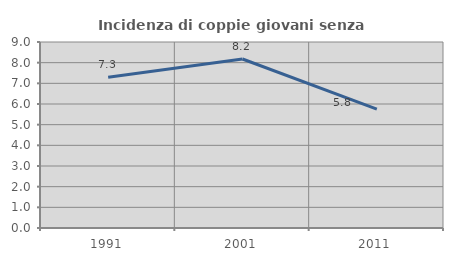
| Category | Incidenza di coppie giovani senza figli |
|---|---|
| 1991.0 | 7.292 |
| 2001.0 | 8.179 |
| 2011.0 | 5.752 |